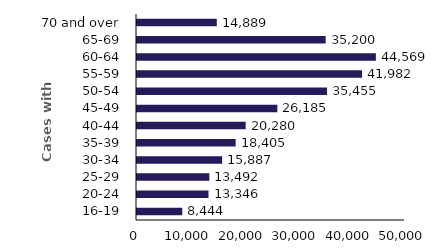
| Category | Series 0 |
|---|---|
| 16-19 | 8444 |
| 20-24 | 13346 |
| 25-29 | 13492 |
| 30-34 | 15887 |
| 35-39 | 18405 |
| 40-44 | 20280 |
| 45-49 | 26185 |
| 50-54 | 35455 |
| 55-59 | 41982 |
| 60-64 | 44569 |
| 65-69 | 35200 |
| 70 and over | 14889 |